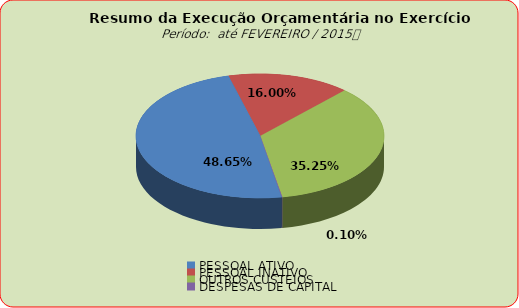
| Category | Series 0 |
|---|---|
| PESSOAL ATIVO | 21979997.71 |
| PESSOAL INATIVO | 7229646.1 |
| OUTROS CUSTEIOS | 15927957.38 |
| DESPESAS DE CAPITAL | 43749 |